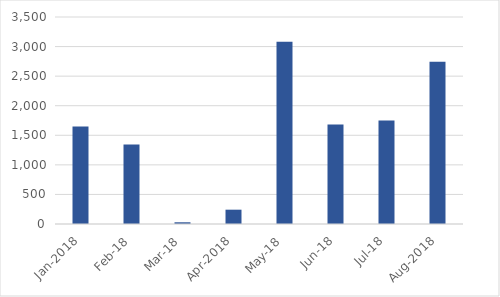
| Category | Series 0 |
|---|---|
| Jan-2018 | 1649 |
| feb-18 | 1346 |
| mar-18 | 29 |
| Apr-2018 | 242 |
| may-18 | 3083 |
| jun-18 | 1683 |
| jul-18 | 1749 |
| Aug-2018 | 2742 |